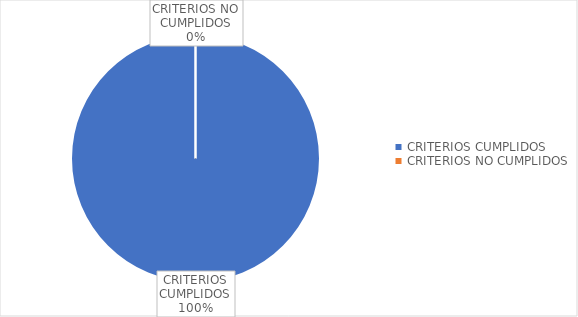
| Category | Series 0 |
|---|---|
| CRITERIOS CUMPLIDOS | 104 |
| CRITERIOS NO CUMPLIDOS | 0 |